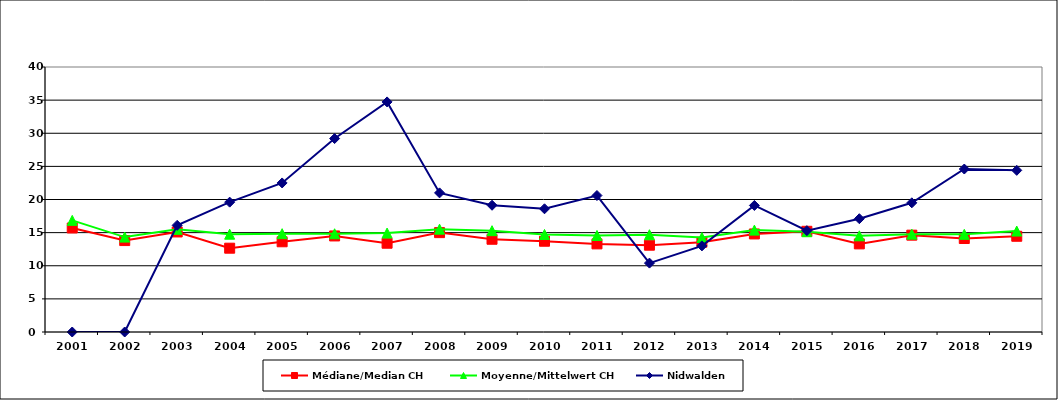
| Category | Médiane/Median CH | Moyenne/Mittelwert CH | Nidwalden |
|---|---|---|---|
| 2001.0 | 15.7 | 16.85 | 0 |
| 2002.0 | 13.8 | 14.325 | 0 |
| 2003.0 | 15.1 | 15.5 | 16.1 |
| 2004.0 | 12.65 | 14.763 | 19.6 |
| 2005.0 | 13.62 | 14.838 | 22.5 |
| 2006.0 | 14.5 | 14.827 | 29.2 |
| 2007.0 | 13.4 | 14.936 | 34.73 |
| 2008.0 | 15 | 15.524 | 21 |
| 2009.0 | 14 | 15.293 | 19.13 |
| 2010.0 | 13.7 | 14.722 | 18.6 |
| 2011.0 | 13.3 | 14.574 | 20.6 |
| 2012.0 | 13.1 | 14.682 | 10.4 |
| 2013.0 | 13.55 | 14.269 | 13 |
| 2014.0 | 14.8 | 15.38 | 19.1 |
| 2015.0 | 15.2 | 15.136 | 15.3 |
| 2016.0 | 13.3 | 14.519 | 17.1 |
| 2017.0 | 14.617 | 14.771 | 19.5 |
| 2018.0 | 14.111 | 14.743 | 24.6 |
| 2019.0 | 14.45 | 15.236 | 24.4 |